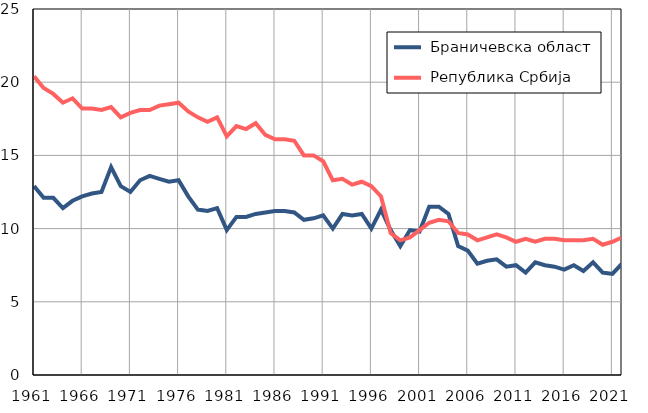
| Category |  Браничевска област |  Република Србија |
|---|---|---|
| 1961.0 | 12.9 | 20.4 |
| 1962.0 | 12.1 | 19.6 |
| 1963.0 | 12.1 | 19.2 |
| 1964.0 | 11.4 | 18.6 |
| 1965.0 | 11.9 | 18.9 |
| 1966.0 | 12.2 | 18.2 |
| 1967.0 | 12.4 | 18.2 |
| 1968.0 | 12.5 | 18.1 |
| 1969.0 | 14.2 | 18.3 |
| 1970.0 | 12.9 | 17.6 |
| 1971.0 | 12.5 | 17.9 |
| 1972.0 | 13.3 | 18.1 |
| 1973.0 | 13.6 | 18.1 |
| 1974.0 | 13.4 | 18.4 |
| 1975.0 | 13.2 | 18.5 |
| 1976.0 | 13.3 | 18.6 |
| 1977.0 | 12.2 | 18 |
| 1978.0 | 11.3 | 17.6 |
| 1979.0 | 11.2 | 17.3 |
| 1980.0 | 11.4 | 17.6 |
| 1981.0 | 9.9 | 16.3 |
| 1982.0 | 10.8 | 17 |
| 1983.0 | 10.8 | 16.8 |
| 1984.0 | 11 | 17.2 |
| 1985.0 | 11.1 | 16.4 |
| 1986.0 | 11.2 | 16.1 |
| 1987.0 | 11.2 | 16.1 |
| 1988.0 | 11.1 | 16 |
| 1989.0 | 10.6 | 15 |
| 1990.0 | 10.7 | 15 |
| 1991.0 | 10.9 | 14.6 |
| 1992.0 | 10 | 13.3 |
| 1993.0 | 11 | 13.4 |
| 1994.0 | 10.9 | 13 |
| 1995.0 | 11 | 13.2 |
| 1996.0 | 10 | 12.9 |
| 1997.0 | 11.3 | 12.2 |
| 1998.0 | 9.9 | 9.7 |
| 1999.0 | 8.8 | 9.2 |
| 2000.0 | 9.9 | 9.4 |
| 2001.0 | 9.8 | 9.9 |
| 2002.0 | 11.5 | 10.4 |
| 2003.0 | 11.5 | 10.6 |
| 2004.0 | 11 | 10.5 |
| 2005.0 | 8.8 | 9.7 |
| 2006.0 | 8.5 | 9.6 |
| 2007.0 | 7.6 | 9.2 |
| 2008.0 | 7.8 | 9.4 |
| 2009.0 | 7.9 | 9.6 |
| 2010.0 | 7.4 | 9.4 |
| 2011.0 | 7.5 | 9.1 |
| 2012.0 | 7 | 9.3 |
| 2013.0 | 7.7 | 9.1 |
| 2014.0 | 7.5 | 9.3 |
| 2015.0 | 7.4 | 9.3 |
| 2016.0 | 7.2 | 9.2 |
| 2017.0 | 7.5 | 9.2 |
| 2018.0 | 7.1 | 9.2 |
| 2019.0 | 7.7 | 9.3 |
| 2020.0 | 7 | 8.9 |
| 2021.0 | 6.9 | 9.1 |
| 2022.0 | 7.6 | 9.4 |